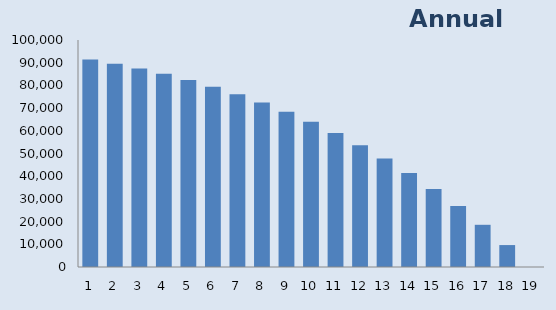
| Category | Balance |
|---|---|
| 0 | 91374.644 |
| 1 | 89541.633 |
| 2 | 87452.33 |
| 3 | 85088.434 |
| 4 | 82430.483 |
| 5 | 79457.79 |
| 6 | 76148.365 |
| 7 | 72478.836 |
| 8 | 68424.367 |
| 9 | 63958.566 |
| 10 | 59053.392 |
| 11 | 53679.054 |
| 12 | 47803.904 |
| 13 | 41394.327 |
| 14 | 34414.62 |
| 15 | 26826.863 |
| 16 | 18590.788 |
| 17 | 9663.635 |
| 18 | 0 |